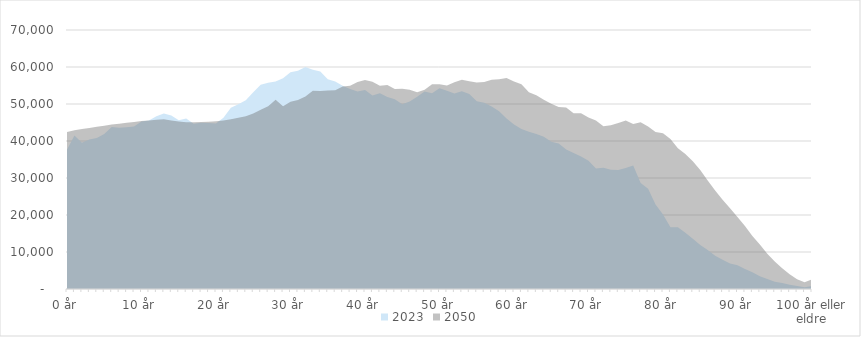
| Category | 2023 | 2050 |
|---|---|---|
| 0 år | 37643 | 42454 |
| 1 år | 41497 | 42897 |
| 2 år | 39533 | 43223 |
| 3 år | 40419 | 43538 |
| 4 år | 40840 | 43835 |
| 5 år | 41907 | 44149 |
| 6 år | 43796 | 44429 |
| 7 år | 43588 | 44693 |
| 8 år | 43726 | 44946 |
| 9 år | 43927 | 45161 |
| 10 år | 45288 | 45374 |
| 11 år | 45558 | 45550 |
| 12 år | 46688 | 45710 |
| 13 år | 47434 | 45871 |
| 14 år | 46906 | 45552 |
| 15 år | 45615 | 45265 |
| 16 år | 46101 | 45046 |
| 17 år | 44649 | 45055 |
| 18 år | 44940 | 45111 |
| 19 år | 44843 | 45202 |
| 20 år | 44713 | 45356 |
| 21 år | 46302 | 45560 |
| 22 år | 48995 | 45885 |
| 23 år | 49901 | 46290 |
| 24 år | 51028 | 46713 |
| 25 år | 53182 | 47455 |
| 26 år | 55173 | 48474 |
| 27 år | 55742 | 49371 |
| 28 år | 56083 | 51141 |
| 29 år | 56941 | 49404 |
| 30 år | 58561 | 50595 |
| 31 år | 58955 | 51060 |
| 32 år | 59978 | 52053 |
| 33 år | 59241 | 53565 |
| 34 år | 58813 | 53481 |
| 35 år | 56660 | 53642 |
| 36 år | 56048 | 53695 |
| 37 år | 54938 | 54740 |
| 38 år | 54039 | 54954 |
| 39 år | 53402 | 55914 |
| 40 år | 53779 | 56500 |
| 41 år | 52319 | 55980 |
| 42 år | 52875 | 54910 |
| 43 år | 51896 | 55127 |
| 44 år | 51284 | 54080 |
| 45 år | 49946 | 54112 |
| 46 år | 50686 | 53850 |
| 47 år | 51951 | 53207 |
| 48 år | 53361 | 53876 |
| 49 år | 52914 | 55330 |
| 50 år | 54230 | 55319 |
| 51 år | 53598 | 55003 |
| 52 år | 52847 | 55849 |
| 53 år | 53415 | 56543 |
| 54 år | 52679 | 56175 |
| 55 år | 50751 | 55789 |
| 56 år | 50323 | 55918 |
| 57 år | 49353 | 56551 |
| 58 år | 48029 | 56662 |
| 59 år | 46094 | 57030 |
| 60 år | 44487 | 56092 |
| 61 år | 43238 | 55329 |
| 62 år | 42512 | 53196 |
| 63 år | 41860 | 52384 |
| 64 år | 41133 | 51119 |
| 65 år | 39775 | 50040 |
| 66 år | 39356 | 49180 |
| 67 år | 37726 | 49023 |
| 68 år | 36729 | 47520 |
| 69 år | 35787 | 47486 |
| 70 år | 34664 | 46341 |
| 71 år | 32554 | 45565 |
| 72 år | 32777 | 44006 |
| 73 år | 32232 | 44256 |
| 74 år | 32159 | 44855 |
| 75 år | 32699 | 45524 |
| 76 år | 33388 | 44628 |
| 77 år | 28654 | 45084 |
| 78 år | 27109 | 43919 |
| 79 år | 22834 | 42461 |
| 80 år | 20106 | 42102 |
| 81 år | 16702 | 40510 |
| 82 år | 16699 | 38073 |
| 83 år | 15193 | 36515 |
| 84 år | 13597 | 34533 |
| 85 år | 11904 | 32188 |
| 86 år | 10509 | 29338 |
| 87 år | 8955 | 26644 |
| 88 år | 7875 | 24124 |
| 89 år | 6902 | 21857 |
| 90 år | 6399 | 19451 |
| 91 år | 5378 | 17015 |
| 92 år | 4497 | 14300 |
| 93 år | 3473 | 12023 |
| 94 år | 2703 | 9513 |
| 95 år | 1969 | 7428 |
| 96 år | 1617 | 5581 |
| 97 år | 1131 | 4004 |
| 98 år | 778 | 2657 |
| 99 år | 483 | 1807 |
| 100 år eller eldre | 816 | 2592 |